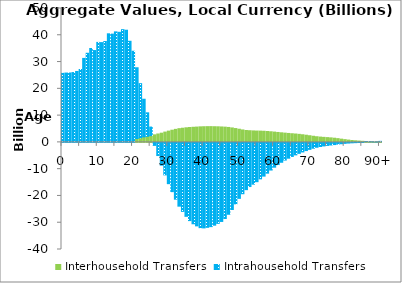
| Category | Interhousehold Transfers | Intrahousehold Transfers |
|---|---|---|
| 0 | 0 | 25797.838 |
|  | 0 | 25890.237 |
| 2 | 0 | 25918.782 |
| 3 | 0 | 26081.943 |
| 4 | 0 | 26491.017 |
| 5 | 0 | 27227.775 |
| 6 | 0 | 31361.373 |
| 7 | 0 | 33283.833 |
| 8 | 0 | 35064.352 |
| 9 | 0 | 34298.746 |
| 10 | 0 | 37342.04 |
| 11 | 0 | 37257.692 |
| 12 | 0 | 37680.638 |
| 13 | 0 | 40549.447 |
| 14 | 0 | 40426.161 |
| 15 | 0 | 41268.813 |
| 16 | 0 | 41108.008 |
| 17 | 0 | 42100.639 |
| 18 | 0 | 41889.562 |
| 19 | 0 | 37763.752 |
| 20 | 0 | 34039.008 |
| 21 | 1437.311 | 26430.686 |
| 22 | 1714.638 | 20217.764 |
| 23 | 2065.376 | 14046.728 |
| 24 | 2275.486 | 8764.379 |
| 25 | 2536.32 | 3183.602 |
| 26 | 2815.177 | -1122.052 |
| 27 | 3136.86 | -4911.907 |
| 28 | 3438.155 | -8513.478 |
| 29 | 3846.352 | -12135.768 |
| 30 | 4204.81 | -15416.188 |
| 31 | 4548.437 | -18393.077 |
| 32 | 4864.98 | -21203.872 |
| 33 | 5125.524 | -23815.294 |
| 34 | 5288.947 | -25768.691 |
| 35 | 5450.139 | -27611.585 |
| 36 | 5561.961 | -29206.78 |
| 37 | 5643.165 | -30393.608 |
| 38 | 5719.121 | -31176.201 |
| 39 | 5801.213 | -31847.972 |
| 40 | 5847.187 | -31935.199 |
| 41 | 5876.75 | -31714.985 |
| 42 | 5883.838 | -31464.169 |
| 43 | 5850.759 | -30917.396 |
| 44 | 5822.251 | -30256.52 |
| 45 | 5762.944 | -29524.643 |
| 46 | 5692.206 | -28415.504 |
| 47 | 5580.633 | -26843.587 |
| 48 | 5396.532 | -25056.115 |
| 49 | 5165.126 | -22945.585 |
| 50 | 4917.202 | -20902.142 |
| 51 | 4654.751 | -19179.167 |
| 52 | 4448.826 | -17654.678 |
| 53 | 4353.899 | -16492.238 |
| 54 | 4285.676 | -15597.556 |
| 55 | 4233.451 | -14671.42 |
| 56 | 4206.832 | -13619.247 |
| 57 | 4157.509 | -12594.931 |
| 58 | 4064.876 | -11490.948 |
| 59 | 3963.525 | -10326.03 |
| 60 | 3845.639 | -9264.279 |
| 61 | 3706.208 | -8300.383 |
| 62 | 3581.61 | -7426.393 |
| 63 | 3455.774 | -6607.695 |
| 64 | 3337.287 | -5897.14 |
| 65 | 3231.566 | -5245.075 |
| 66 | 3129.14 | -4664.409 |
| 67 | 3002.305 | -4094.011 |
| 68 | 2851.333 | -3565.736 |
| 69 | 2679.118 | -3060.7 |
| 70 | 2488.1 | -2602.041 |
| 71 | 2291.634 | -2172.971 |
| 72 | 2114.026 | -1814.891 |
| 73 | 1979.867 | -1539.432 |
| 74 | 1881.322 | -1321.367 |
| 75 | 1785.696 | -1132.64 |
| 76 | 1685.842 | -975.124 |
| 77 | 1561.545 | -815.996 |
| 78 | 1399.966 | -650.798 |
| 79 | 1208.306 | -495.785 |
| 80 | 1030.314 | -360.051 |
| 81 | 863.223 | -247.857 |
| 82 | 715.804 | -161.723 |
| 83 | 594.36 | -100.269 |
| 84 | 494.954 | -51.148 |
| 85 | 401.286 | -14.851 |
| 86 | 315.51 | 10.456 |
| 87 | 242.804 | 26.517 |
| 88 | 183.948 | 36.441 |
| 89 | 137.08 | 38.912 |
| 90+ | 280.954 | 104.155 |